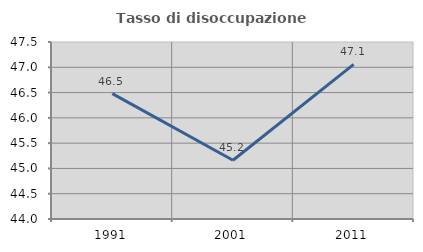
| Category | Tasso di disoccupazione giovanile  |
|---|---|
| 1991.0 | 46.479 |
| 2001.0 | 45.161 |
| 2011.0 | 47.059 |